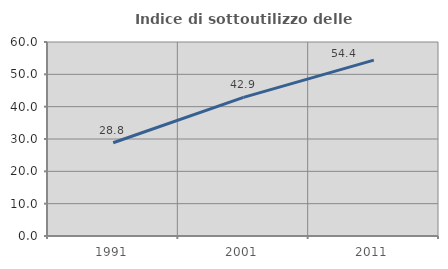
| Category | Indice di sottoutilizzo delle abitazioni  |
|---|---|
| 1991.0 | 28.843 |
| 2001.0 | 42.877 |
| 2011.0 | 54.384 |